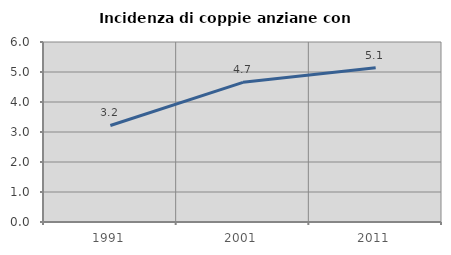
| Category | Incidenza di coppie anziane con figli |
|---|---|
| 1991.0 | 3.218 |
| 2001.0 | 4.656 |
| 2011.0 | 5.144 |